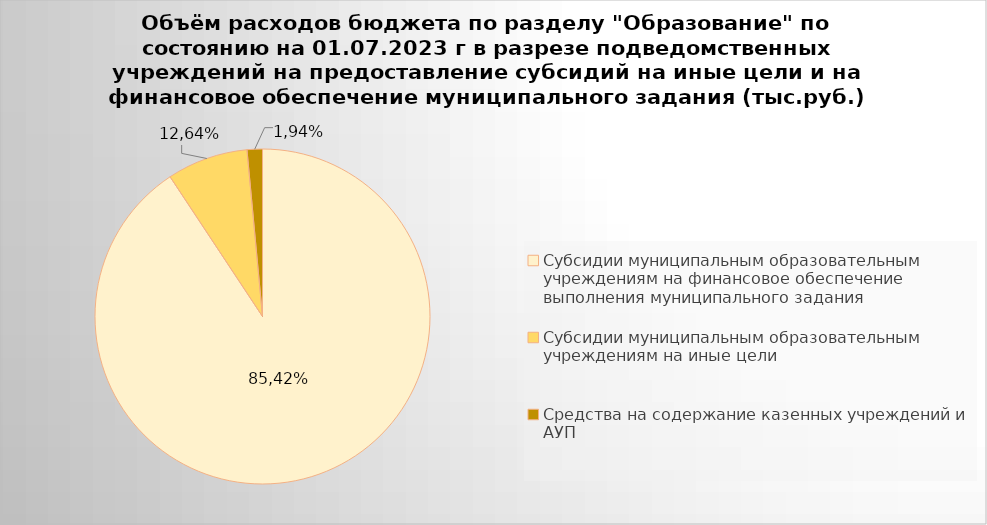
| Category | Series 0 |
|---|---|
| Субсидии муниципальным образовательным учреждениям на финансовое обеспечение выполнения муниципального задания | 7946543.18 |
| Субсидии муниципальным образовательным учреждениям на иные цели | 685341.3 |
| Средства на содержание казенных учреждений и АУП | 129596.07 |